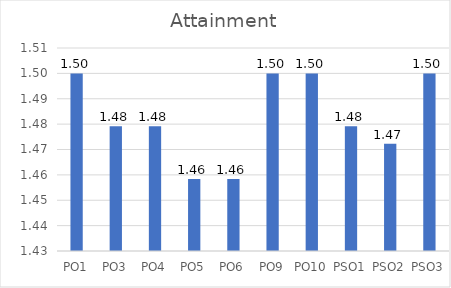
| Category | Attainment |
|---|---|
| PO1 | 1.5 |
| PO3 | 1.479 |
| PO4 | 1.479 |
| PO5 | 1.458 |
| PO6 | 1.458 |
| PO9 | 1.5 |
| PO10 | 1.5 |
| PSO1 | 1.479 |
| PSO2 | 1.472 |
| PSO3 | 1.5 |